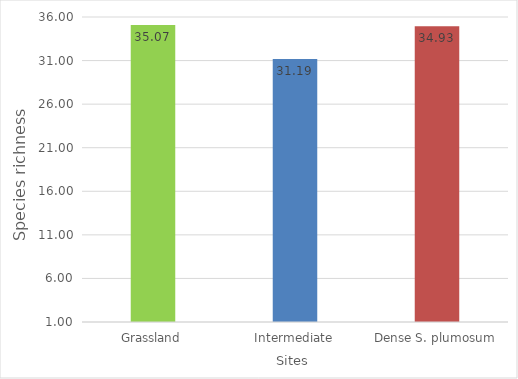
| Category | Margalef’s index |
|---|---|
| Grassland | 35.07 |
| Intermediate | 31.189 |
| Dense S. plumosum | 34.926 |